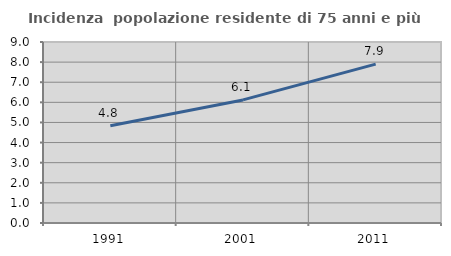
| Category | Incidenza  popolazione residente di 75 anni e più |
|---|---|
| 1991.0 | 4.834 |
| 2001.0 | 6.12 |
| 2011.0 | 7.901 |